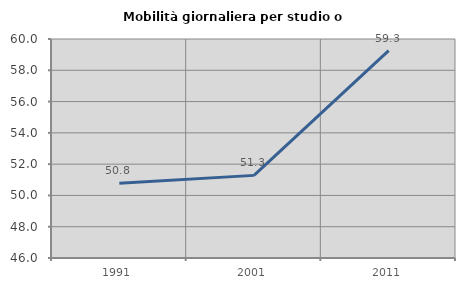
| Category | Mobilità giornaliera per studio o lavoro |
|---|---|
| 1991.0 | 50.773 |
| 2001.0 | 51.282 |
| 2011.0 | 59.259 |